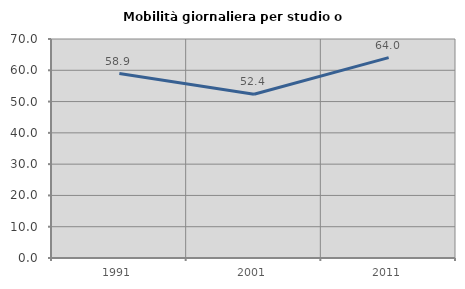
| Category | Mobilità giornaliera per studio o lavoro |
|---|---|
| 1991.0 | 58.95 |
| 2001.0 | 52.358 |
| 2011.0 | 64.035 |